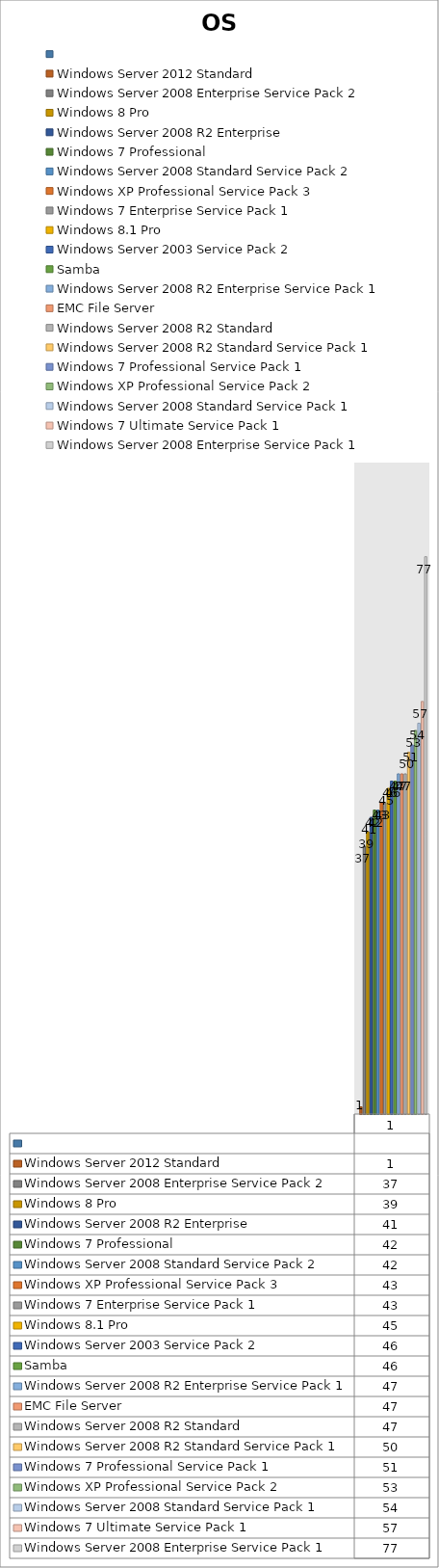
| Category | Series 0 | Windows Server 2012 Standard  | Windows Server 2008 Enterprise Service Pack 2 | Windows 8 Pro  | Windows Server 2008 R2 Enterprise  | Windows 7 Professional  | Windows Server 2008 Standard Service Pack 2 | Windows XP Professional Service Pack 3 | Windows 7 Enterprise Service Pack 1 | Windows 8.1 Pro  | Windows Server 2003 Service Pack 2 | Samba  | Windows Server 2008 R2 Enterprise Service Pack 1 | EMC File Server  | Windows Server 2008 R2 Standard  | Windows Server 2008 R2 Standard Service Pack 1 | Windows 7 Professional Service Pack 1 | Windows XP Professional Service Pack 2 | Windows Server 2008 Standard Service Pack 1 | Windows 7 Ultimate Service Pack 1 | Windows Server 2008 Enterprise Service Pack 1 |
|---|---|---|---|---|---|---|---|---|---|---|---|---|---|---|---|---|---|---|---|---|---|
| 0 |  | 1 | 37 | 39 | 41 | 42 | 42 | 43 | 43 | 45 | 46 | 46 | 47 | 47 | 47 | 50 | 51 | 53 | 54 | 57 | 77 |